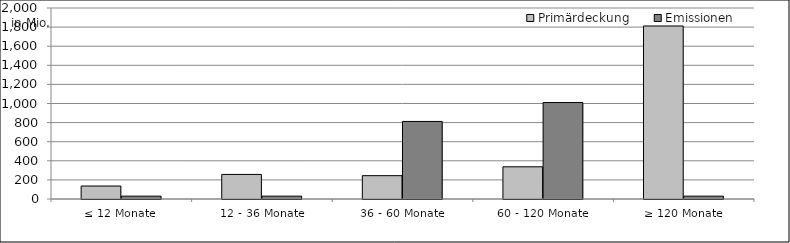
| Category | Primärdeckung | Emissionen |
|---|---|---|
| ≤ 12 Monate | 135825373.621 | 30000000 |
| 12 - 36 Monate | 257314795.763 | 30000000 |
| 36 - 60 Monate | 244337769.03 | 812086000 |
| 60 - 120 Monate | 337192221.677 | 1010000000 |
| ≥ 120 Monate | 1811717566.381 | 30000000 |